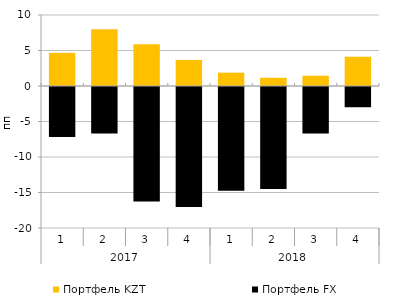
| Category | Портфель KZT | Портфель FX |
|---|---|---|
| 0 | 4.67 | -7.046 |
| 1 | 7.979 | -6.557 |
| 2 | 5.863 | -16.11 |
| 3 | 3.67 | -16.894 |
| 4 | 1.879 | -14.613 |
| 5 | 1.162 | -14.366 |
| 6 | 1.447 | -6.546 |
| 7 | 4.119 | -2.852 |